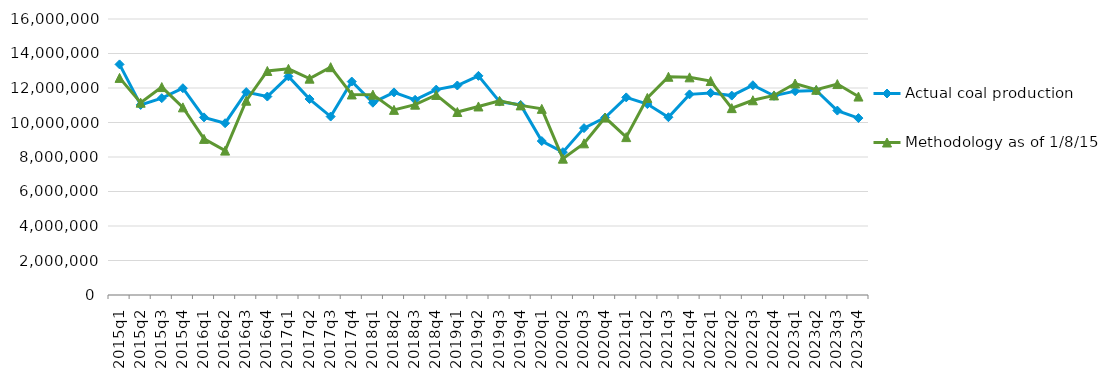
| Category | Actual coal production | Methodology as of 1/8/15 |
|---|---|---|
| 2015q1 | 13368190 | 12586133 |
| 2015q2 | 11019093 | 11147953 |
| 2015q3 | 11410361 | 12053943 |
| 2015q4 | 11987517 | 10877838 |
| 2016q1 | 10297305 | 9050490 |
| 2016q2 | 9959082 | 8370083 |
| 2016q3 | 11762690 | 11263094 |
| 2016q4 | 11505301 | 12986499 |
| 2017q1 | 12675129 | 13111629 |
| 2017q2 | 11359095 | 12541286 |
| 2017q3 | 10344941 | 13207804 |
| 2017q4 | 12374976 | 11625428 |
| 2018q1 | 11147535 | 11614680 |
| 2018q2 | 11745846 | 10732552 |
| 2018q3 | 11314875 | 11034012 |
| 2018q4 | 11906735 | 11597840 |
| 2019q1 | 12145079 | 10607968 |
| 2019q2 | 12704333 | 10929654 |
| 2019q3 | 11211719 | 11259011 |
| 2019q4 | 11017274 | 10992109 |
| 2020q1 | 8925706 | 10789907 |
| 2020q2 | 8281127 | 7903899 |
| 2020q3 | 9674260 | 8791857 |
| 2020q4 | 10287411 | 10287411 |
| 2021q1 | 11455094 | 9152227 |
| 2021q2 | 11068208 | 11423990 |
| 2021q3 | 10306357 | 12651410 |
| 2021q4 | 11630807 | 12618122 |
| 2022q1 | 11713945 | 12404121 |
| 2022q2 | 11560379 | 10833331 |
| 2022q3 | 12160052 | 11288159 |
| 2022q4 | 11548483 | 11569055 |
| 2023q1 | 11817576 | 12259988 |
| 2023q2 | 11855726 | 11896741 |
| 2023q3 | 10690856 | 12227578 |
| 2023q4 | 10256070 | 11504318 |